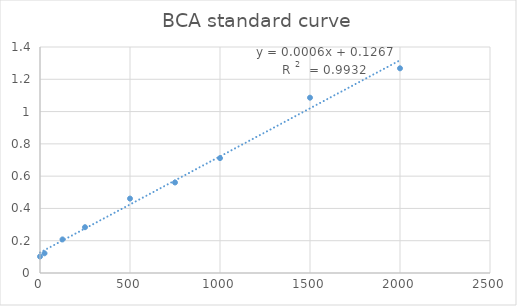
| Category | Series 0 |
|---|---|
| 0.0 | 0.102 |
| 25.0 | 0.122 |
| 125.0 | 0.208 |
| 250.0 | 0.284 |
| 500.0 | 0.461 |
| 750.0 | 0.561 |
| 1000.0 | 0.712 |
| 1500.0 | 1.086 |
| 2000.0 | 1.268 |